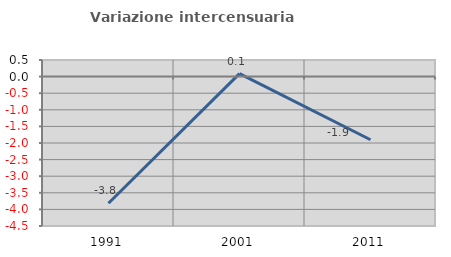
| Category | Variazione intercensuaria annua |
|---|---|
| 1991.0 | -3.815 |
| 2001.0 | 0.089 |
| 2011.0 | -1.903 |